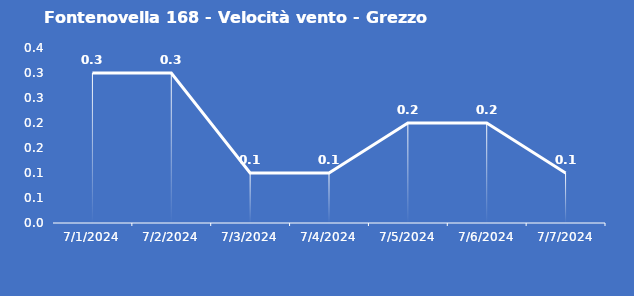
| Category | Fontenovella 168 - Velocità vento - Grezzo (m/s) |
|---|---|
| 7/1/24 | 0.3 |
| 7/2/24 | 0.3 |
| 7/3/24 | 0.1 |
| 7/4/24 | 0.1 |
| 7/5/24 | 0.2 |
| 7/6/24 | 0.2 |
| 7/7/24 | 0.1 |